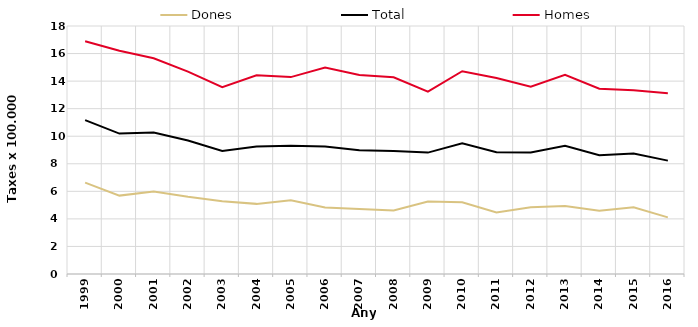
| Category | Dones | Total | Homes |
|---|---|---|---|
| 1999.0 | 6.63 | 11.17 | 16.89 |
| 2000.0 | 5.69 | 10.19 | 16.2 |
| 2001.0 | 5.99 | 10.27 | 15.66 |
| 2002.0 | 5.6 | 9.69 | 14.69 |
| 2003.0 | 5.28 | 8.93 | 13.56 |
| 2004.0 | 5.09 | 9.25 | 14.42 |
| 2005.0 | 5.35 | 9.3 | 14.29 |
| 2006.0 | 4.82 | 9.26 | 14.98 |
| 2007.0 | 4.72 | 8.99 | 14.44 |
| 2008.0 | 4.61 | 8.93 | 14.28 |
| 2009.0 | 5.26 | 8.81 | 13.24 |
| 2010.0 | 5.2 | 9.49 | 14.72 |
| 2011.0 | 4.47 | 8.84 | 14.22 |
| 2012.0 | 4.84 | 8.82 | 13.6 |
| 2013.0 | 4.94 | 9.31 | 14.46 |
| 2014.0 | 4.59 | 8.62 | 13.45 |
| 2015.0 | 4.84 | 8.74 | 13.33 |
| 2016.0 | 4.11 | 8.23 | 13.12 |